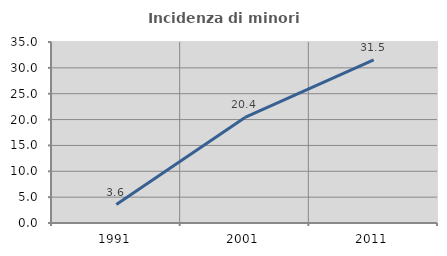
| Category | Incidenza di minori stranieri |
|---|---|
| 1991.0 | 3.571 |
| 2001.0 | 20.408 |
| 2011.0 | 31.522 |